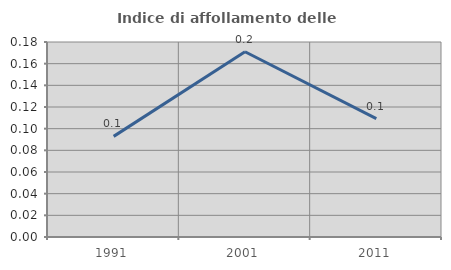
| Category | Indice di affollamento delle abitazioni  |
|---|---|
| 1991.0 | 0.093 |
| 2001.0 | 0.171 |
| 2011.0 | 0.109 |